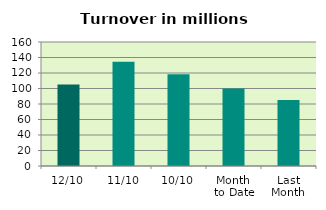
| Category | Series 0 |
|---|---|
| 12/10 | 105.176 |
| 11/10 | 134.356 |
| 10/10 | 118.317 |
| Month 
to Date | 99.909 |
| Last
Month | 85.072 |